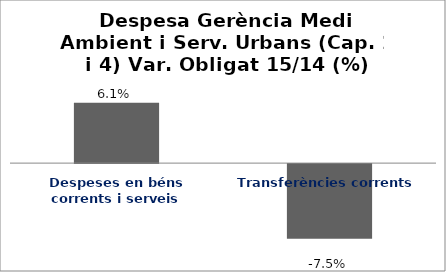
| Category | Series 0 |
|---|---|
| Despeses en béns corrents i serveis | 0.061 |
| Transferències corrents | -0.075 |